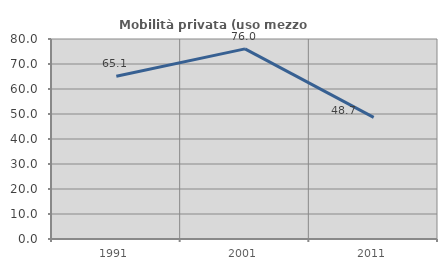
| Category | Mobilità privata (uso mezzo privato) |
|---|---|
| 1991.0 | 65.116 |
| 2001.0 | 76.042 |
| 2011.0 | 48.673 |